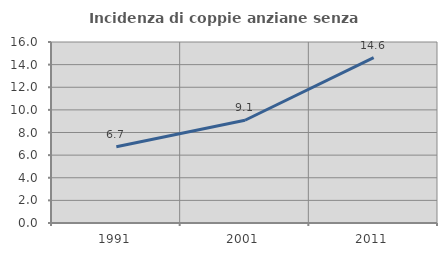
| Category | Incidenza di coppie anziane senza figli  |
|---|---|
| 1991.0 | 6.748 |
| 2001.0 | 9.082 |
| 2011.0 | 14.62 |